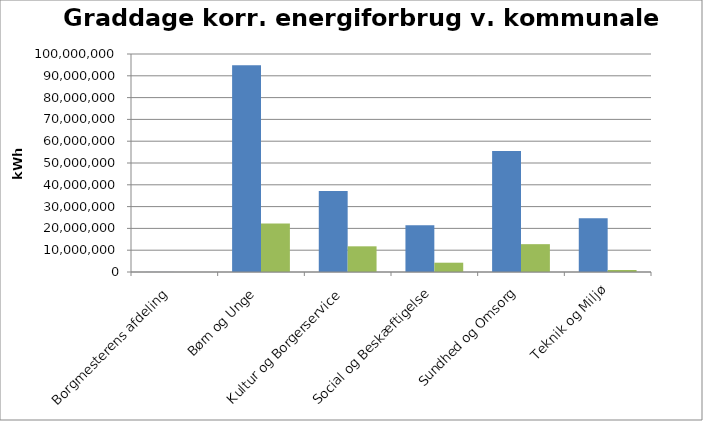
| Category | 2009 | 2010 |
|---|---|---|
| Borgmesterens afdeling | 24390 | 0 |
| Børn og Unge | 94853943 | 22281359 |
| Kultur og Borgerservice | 37167421 | 11780844 |
| Social og Beskæftigelse | 21446993 | 4267894 |
| Sundhed og Omsorg | 55548219 | 12767000 |
| Teknik og Miljø | 24682759 | 926718 |